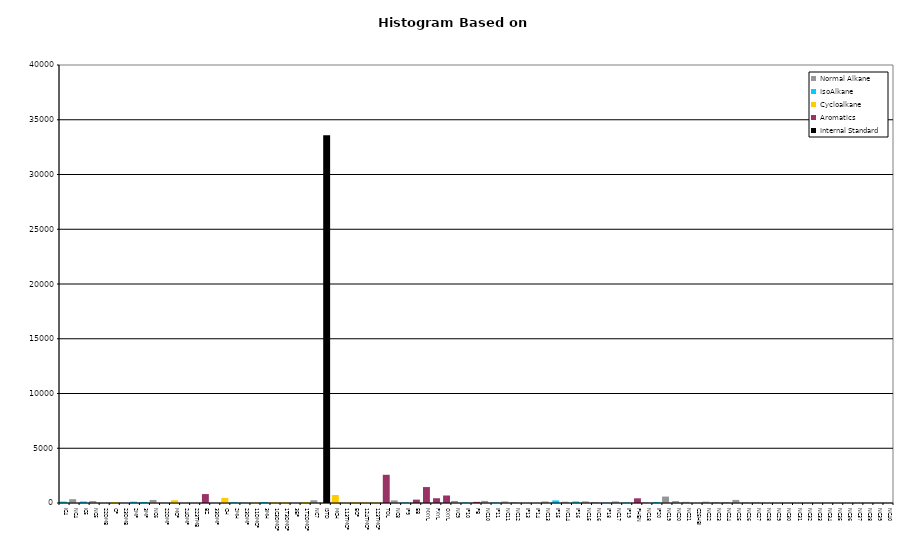
| Category | Normal Alkane | IsoAlkane | Cycloalkane | Aromatics | Internal Standard |
|---|---|---|---|---|---|
| IC4 | 0 | 130 | 0 | 0 | 0 |
| NC4 | 350 | 0 | 0 | 0 | 0 |
| IC5 | 0 | 137 | 0 | 0 | 0 |
| NC5 | 176 | 0 | 0 | 0 | 0 |
| 22DMB | 0 | 0 | 0 | 0 | 0 |
| CP | 0 | 0 | 90 | 0 | 0 |
| 23DMB | 0 | 0 | 0 | 0 | 0 |
| 2MP | 0 | 122 | 0 | 0 | 0 |
| 3MP | 0 | 97 | 0 | 0 | 0 |
| NC6 | 280 | 0 | 0 | 0 | 0 |
| 22DMP | 0 | 0 | 0 | 0 | 0 |
| MCP | 0 | 0 | 255 | 0 | 0 |
| 24DMP | 0 | 0 | 0 | 0 | 0 |
| 223TMB | 0 | 0 | 0 | 0 | 0 |
| BZ | 0 | 0 | 0 | 815 | 0 |
| 33DMP | 0 | 0 | 0 | 0 | 0 |
| CH | 0 | 0 | 465 | 0 | 0 |
| 2MH | 0 | 72 | 0 | 0 | 0 |
| 23DMP | 0 | 25 | 0 | 0 | 0 |
| 11DMCP | 0 | 0 | 38 | 0 | 0 |
| 3MH | 0 | 94 | 0 | 0 | 0 |
| 1C3DMCP | 0 | 0 | 59 | 0 | 0 |
| 1T3DMCP | 0 | 0 | 59 | 0 | 0 |
| 3EP | 0 | 0 | 0 | 0 | 0 |
| 1T2DMCP | 0 | 0 | 89 | 0 | 0 |
| NC7 | 251 | 0 | 0 | 0 | 0 |
| ISTD | 0 | 0 | 0 | 0 | 33594 |
| MCH | 0 | 0 | 733 | 0 | 0 |
| 113TMCP | 0 | 0 | 27 | 0 | 0 |
| ECP | 0 | 0 | 66 | 0 | 0 |
| 124TMCP | 0 | 0 | 45 | 0 | 0 |
| 123TMCP | 0 | 0 | 43 | 0 | 0 |
| TOL | 0 | 0 | 0 | 2577 | 0 |
| NC8 | 242 | 0 | 0 | 0 | 0 |
| IP9 | 0 | 53 | 0 | 0 | 0 |
| EB | 0 | 0 | 0 | 309 | 0 |
| MXYL | 0 | 0 | 0 | 1456 | 0 |
| PXYL | 0 | 0 | 0 | 436 | 0 |
| OXYL | 0 | 0 | 0 | 685 | 0 |
| NC9 | 186 | 0 | 0 | 0 | 0 |
| IP10 | 0 | 54 | 0 | 0 | 0 |
| PB | 0 | 0 | 0 | 102 | 0 |
| NC10 | 191 | 0 | 0 | 0 | 0 |
| IP11 | 0 | 57 | 0 | 0 | 0 |
| NC11 | 138 | 0 | 0 | 0 | 0 |
| NC12 | 84 | 0 | 0 | 0 | 0 |
| IP13 | 0 | 0 | 0 | 0 | 0 |
| IP14 | 0 | 0 | 0 | 0 | 0 |
| NC13 | 139 | 0 | 0 | 0 | 0 |
| IP15 | 0 | 235 | 0 | 0 | 0 |
| NC14 | 117 | 0 | 0 | 0 | 0 |
| IP16 | 0 | 142 | 0 | 0 | 0 |
| NC15 | 147 | 0 | 0 | 0 | 0 |
| NC16 | 92 | 0 | 0 | 0 | 0 |
| IP18 | 0 | 38 | 0 | 0 | 0 |
| NC17 | 146 | 0 | 0 | 0 | 0 |
| IP19 | 0 | 51 | 0 | 0 | 0 |
| PHEN | 0 | 0 | 0 | 428 | 0 |
| NC18 | 59 | 0 | 0 | 0 | 0 |
| IP20 | 0 | 89 | 0 | 0 | 0 |
| NC19 | 587 | 0 | 0 | 0 | 0 |
| NC20 | 175 | 0 | 0 | 0 | 0 |
| NC21 | 104 | 0 | 0 | 0 | 0 |
| C25HBI | 0 | 0 | 0 | 0 | 0 |
| NC22 | 120 | 0 | 0 | 0 | 0 |
| NC23 | 89 | 0 | 0 | 0 | 0 |
| NC24 | 89 | 0 | 0 | 0 | 0 |
| NC25 | 281 | 0 | 0 | 0 | 0 |
| NC26 | 58 | 0 | 0 | 0 | 0 |
| NC27 | 62 | 0 | 0 | 0 | 0 |
| NC28 | 0 | 0 | 0 | 0 | 0 |
| NC29 | 0 | 0 | 0 | 0 | 0 |
| NC30 | 0 | 0 | 0 | 0 | 0 |
| NC31 | 0 | 0 | 0 | 0 | 0 |
| NC32 | 0 | 0 | 0 | 0 | 0 |
| NC33 | 0 | 0 | 0 | 0 | 0 |
| NC34 | 0 | 0 | 0 | 0 | 0 |
| NC35 | 0 | 0 | 0 | 0 | 0 |
| NC36 | 0 | 0 | 0 | 0 | 0 |
| NC37 | 0 | 0 | 0 | 0 | 0 |
| NC38 | 0 | 0 | 0 | 0 | 0 |
| NC39 | 0 | 0 | 0 | 0 | 0 |
| NC40 | 0 | 0 | 0 | 0 | 0 |